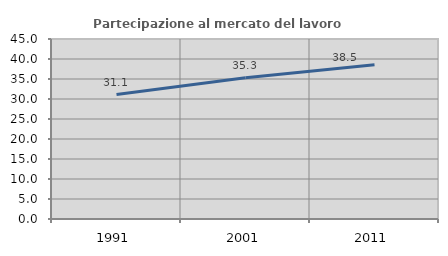
| Category | Partecipazione al mercato del lavoro  femminile |
|---|---|
| 1991.0 | 31.109 |
| 2001.0 | 35.3 |
| 2011.0 | 38.543 |